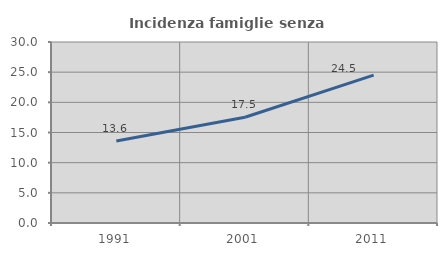
| Category | Incidenza famiglie senza nuclei |
|---|---|
| 1991.0 | 13.6 |
| 2001.0 | 17.526 |
| 2011.0 | 24.5 |